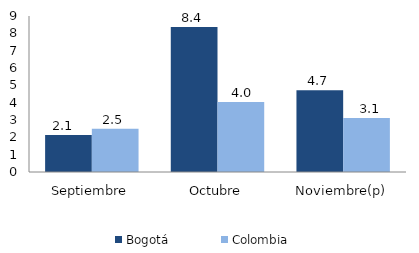
| Category | Bogotá | Colombia |
|---|---|---|
| Septiembre | 2.129 | 2.489 |
| Octubre | 8.37 | 4.039 |
| Noviembre(p) | 4.713 | 3.113 |